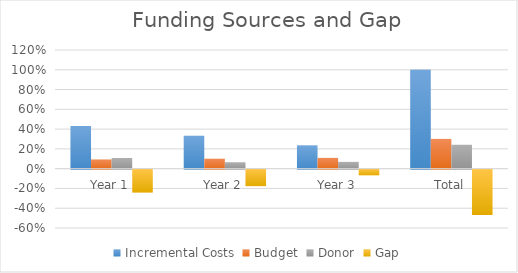
| Category | Incremental Costs | Budget | Donor | Gap |
|---|---|---|---|---|
| Year 1 | 0.431 | 0.092 | 0.108 | -0.232 |
| Year 2 | 0.333 | 0.1 | 0.065 | -0.167 |
| Year 3 | 0.236 | 0.109 | 0.069 | -0.059 |
| Total | 1 | 0.301 | 0.241 | -0.458 |